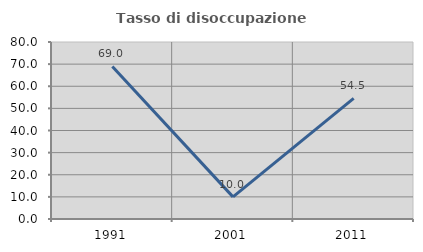
| Category | Tasso di disoccupazione giovanile  |
|---|---|
| 1991.0 | 68.966 |
| 2001.0 | 10 |
| 2011.0 | 54.545 |